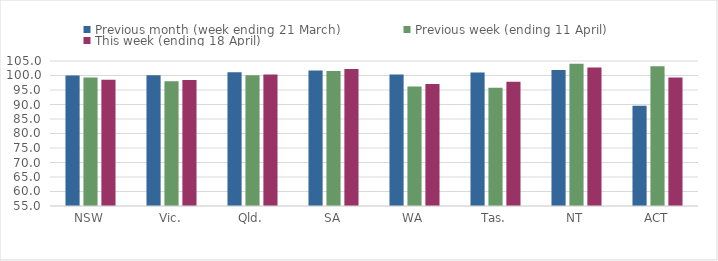
| Category | Previous month (week ending 21 March) | Previous week (ending 11 April) | This week (ending 18 April) |
|---|---|---|---|
| NSW | 100.036 | 99.315 | 98.494 |
| Vic. | 100.113 | 98.046 | 98.444 |
| Qld. | 101.088 | 100.066 | 100.306 |
| SA | 101.722 | 101.562 | 102.223 |
| WA | 100.366 | 96.169 | 97.06 |
| Tas. | 101.064 | 95.771 | 97.883 |
| NT | 101.859 | 104.082 | 102.768 |
| ACT | 89.53 | 103.183 | 99.337 |